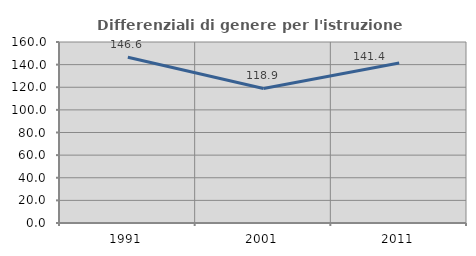
| Category | Differenziali di genere per l'istruzione superiore |
|---|---|
| 1991.0 | 146.575 |
| 2001.0 | 118.935 |
| 2011.0 | 141.35 |